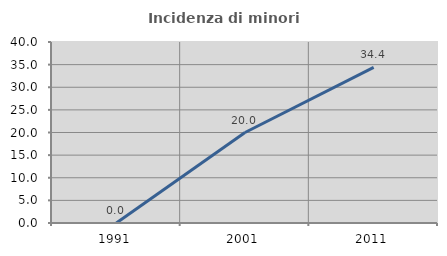
| Category | Incidenza di minori stranieri |
|---|---|
| 1991.0 | 0 |
| 2001.0 | 20 |
| 2011.0 | 34.375 |